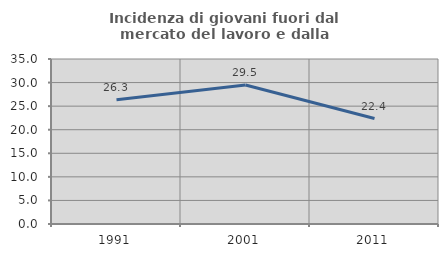
| Category | Incidenza di giovani fuori dal mercato del lavoro e dalla formazione  |
|---|---|
| 1991.0 | 26.334 |
| 2001.0 | 29.47 |
| 2011.0 | 22.374 |